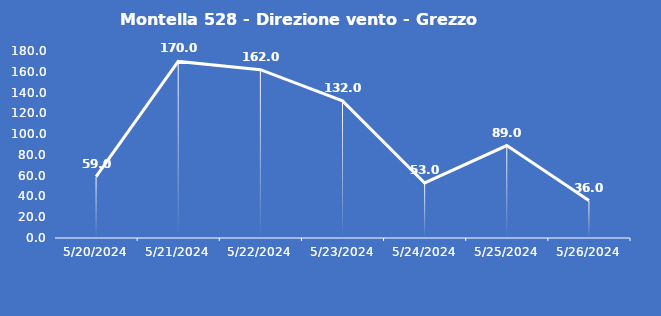
| Category | Montella 528 - Direzione vento - Grezzo (°N) |
|---|---|
| 5/20/24 | 59 |
| 5/21/24 | 170 |
| 5/22/24 | 162 |
| 5/23/24 | 132 |
| 5/24/24 | 53 |
| 5/25/24 | 89 |
| 5/26/24 | 36 |